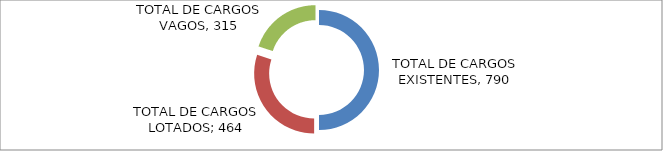
| Category | Series 0 | Series 1 |
|---|---|---|
| TOTAL DE CARGOS EXISTENTES |  | 790 |
| TOTAL DE CARGOS LOTADOS** |  | 475 |
| TOTAL DE CARGOS VAGOS |  | 315 |